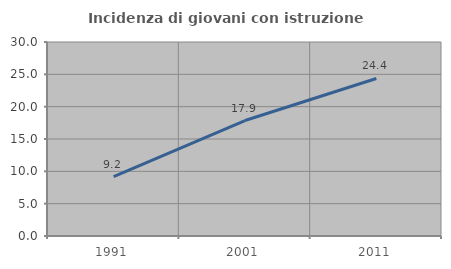
| Category | Incidenza di giovani con istruzione universitaria |
|---|---|
| 1991.0 | 9.195 |
| 2001.0 | 17.857 |
| 2011.0 | 24.359 |